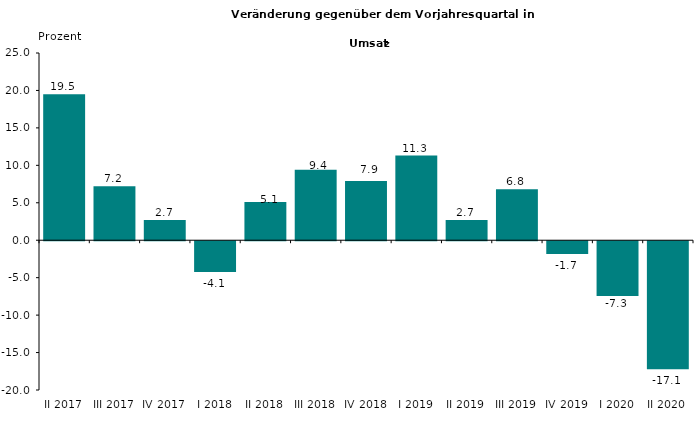
| Category | 19,5 |
|---|---|
| II 2017 | 19.5 |
| III 2017 | 7.2 |
| IV 2017 | 2.7 |
| I 2018 | -4.1 |
| II 2018 | 5.1 |
| III 2018 | 9.4 |
| IV 2018 | 7.9 |
| I 2019 | 11.3 |
| II 2019 | 2.7 |
| III 2019 | 6.8 |
| IV 2019 | -1.7 |
| I 2020 | -7.3 |
| II 2020 | -17.1 |